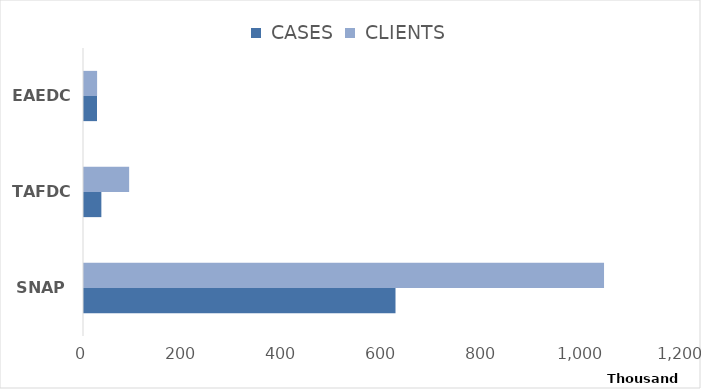
| Category |  CASES |  CLIENTS |
|---|---|---|
| SNAP | 623001 | 1040065 |
| TAFDC | 34719 | 90289 |
| EAEDC | 26039 | 26197 |